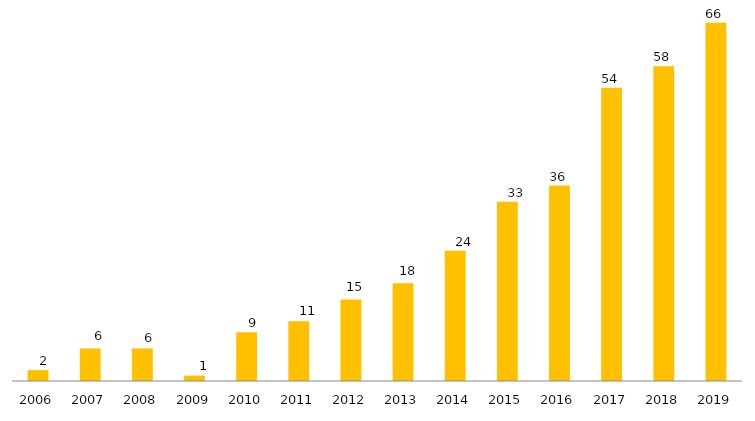
| Category | Programa |
|---|---|
| 2006.0 | 2 |
| 2007.0 | 6 |
| 2008.0 | 6 |
| 2009.0 | 1 |
| 2010.0 | 9 |
| 2011.0 | 11 |
| 2012.0 | 15 |
| 2013.0 | 18 |
| 2014.0 | 24 |
| 2015.0 | 33 |
| 2016.0 | 36 |
| 2017.0 | 54 |
| 2018.0 | 58 |
| 2019.0 | 66 |